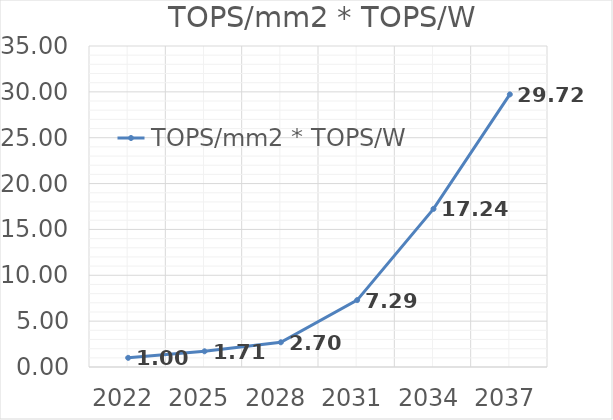
| Category | TOPS/mm2 * TOPS/W |
|---|---|
| 2022.0 | 1 |
| 2025.0 | 1.713 |
| 2028.0 | 2.695 |
| 2031.0 | 7.295 |
| 2034.0 | 17.24 |
| 2037.0 | 29.725 |